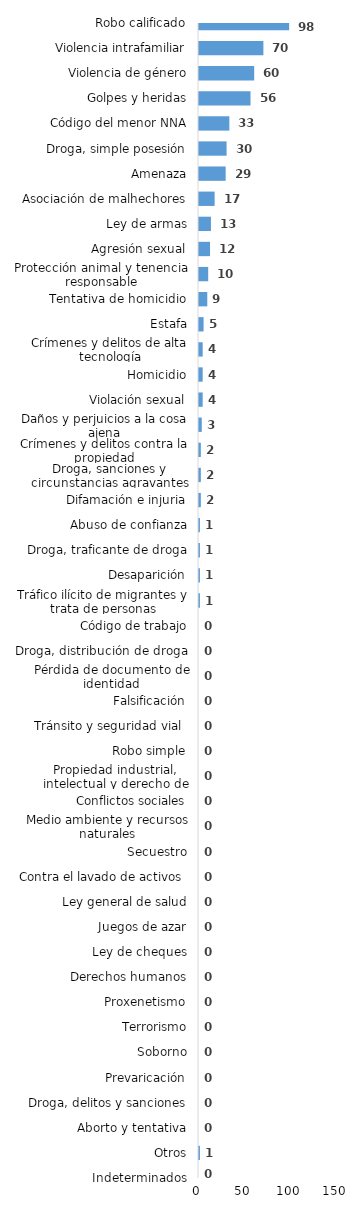
| Category | Series 0 |
|---|---|
| Robo calificado | 98 |
| Violencia intrafamiliar | 70 |
| Violencia de género | 60 |
| Golpes y heridas | 56 |
| Código del menor NNA | 33 |
| Droga, simple posesión | 30 |
| Amenaza | 29 |
| Asociación de malhechores | 17 |
| Ley de armas | 13 |
| Agresión sexual | 12 |
| Protección animal y tenencia responsable | 10 |
| Tentativa de homicidio | 9 |
| Estafa | 5 |
| Crímenes y delitos de alta tecnología | 4 |
| Homicidio | 4 |
| Violación sexual | 4 |
| Daños y perjuicios a la cosa ajena | 3 |
| Crímenes y delitos contra la propiedad | 2 |
| Droga, sanciones y circunstancias agravantes | 2 |
| Difamación e injuria | 2 |
| Abuso de confianza | 1 |
| Droga, traficante de droga | 1 |
| Desaparición | 1 |
| Tráfico ilícito de migrantes y trata de personas | 1 |
| Código de trabajo | 0 |
| Droga, distribución de droga | 0 |
| Pérdida de documento de identidad | 0 |
| Falsificación | 0 |
| Tránsito y seguridad vial  | 0 |
| Robo simple | 0 |
| Propiedad industrial, intelectual y derecho de autor | 0 |
| Conflictos sociales | 0 |
| Medio ambiente y recursos naturales | 0 |
| Secuestro | 0 |
| Contra el lavado de activos  | 0 |
| Ley general de salud | 0 |
| Juegos de azar | 0 |
| Ley de cheques | 0 |
| Derechos humanos | 0 |
| Proxenetismo | 0 |
| Terrorismo | 0 |
| Soborno | 0 |
| Prevaricación | 0 |
| Droga, delitos y sanciones | 0 |
| Aborto y tentativa | 0 |
| Otros | 1 |
| Indeterminados | 0 |